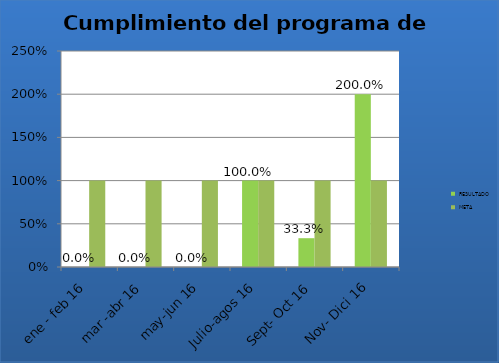
| Category | RESULTADO | META |
|---|---|---|
| ene - feb 16 | 0 | 1 |
| mar -abr 16 | 0 | 1 |
| may-jun 16 | 0 | 1 |
| Julio-agos 16 | 1 | 1 |
| Sept- Oct 16 | 0.333 | 1 |
| Nov- Dici 16 | 2 | 1 |